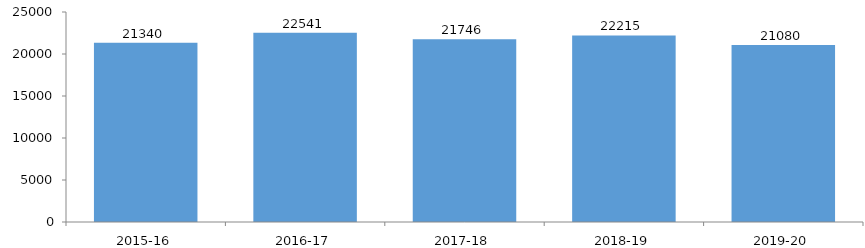
| Category | Homeless Students* |
|---|---|
| 2015-16 | 21340 |
| 2016-17 | 22541 |
| 2017-18 | 21746 |
| 2018-19 | 22215 |
| 2019-20 | 21080 |